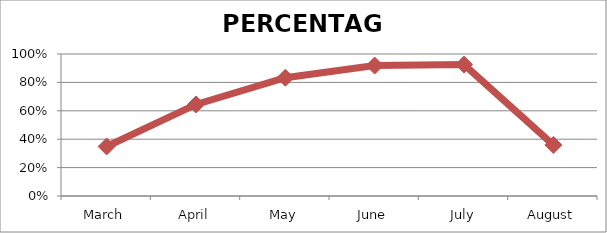
| Category | PERCENTAGE |
|---|---|
| March | 0.349 |
| April | 0.645 |
| May | 0.833 |
| June | 0.918 |
| July | 0.925 |
| August | 0.36 |